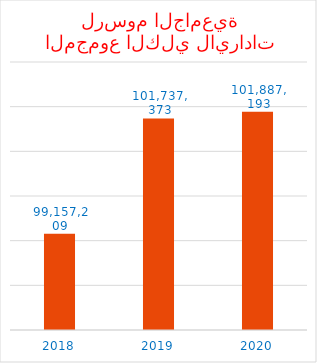
| Category | المجموع الكلي للرسوم الجامعية |
|---|---|
| 2018.0 | 99157209.27 |
| 2019.0 | 101737373.291 |
| 2020.0 | 101887193.256 |